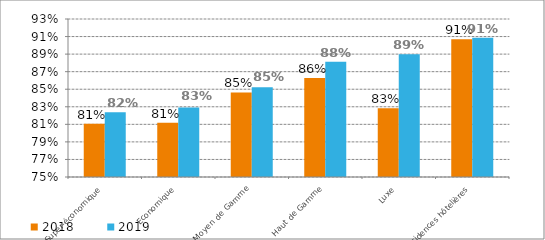
| Category | 2018 | 2019 |
|---|---|---|
| Super-économique | 0.811 | 0.824 |
| Economique | 0.812 | 0.829 |
| Moyen de Gamme | 0.846 | 0.852 |
| Haut de Gamme | 0.863 | 0.881 |
| Luxe | 0.828 | 0.89 |
| Résidences hôtelières | 0.907 | 0.909 |